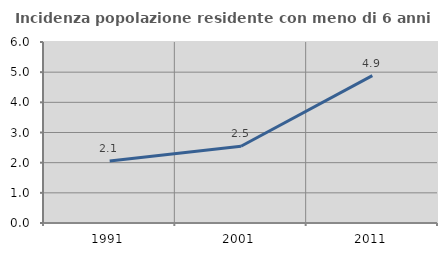
| Category | Incidenza popolazione residente con meno di 6 anni |
|---|---|
| 1991.0 | 2.058 |
| 2001.0 | 2.545 |
| 2011.0 | 4.885 |